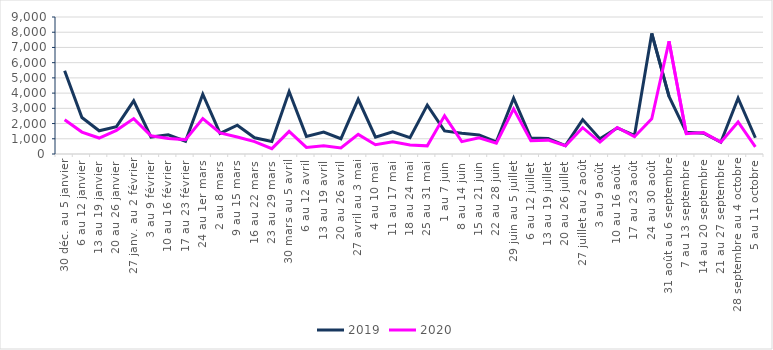
| Category | 2019 | 2020 |
|---|---|---|
| 30 déc. au 5 janvier | 5470 | 2254 |
| 6 au 12 janvier | 2400 | 1440 |
| 13 au 19 janvier | 1527 | 1049 |
| 20 au 26 janvier | 1798 | 1553 |
| 27 janv. au 2 février | 3495 | 2326 |
| 3 au 9 février | 1116 | 1200 |
| 10 au 16 février | 1260 | 1020 |
| 17 au 23 février | 841 | 946 |
| 24 au 1er mars | 3928 | 2332 |
| 2 au 8 mars | 1349 | 1382 |
| 9 au 15 mars | 1893 | 1114 |
| 16 au 22 mars | 1068 | 810 |
| 23 au 29 mars | 828 | 350 |
| 30 mars au 5 avril | 4105 | 1483 |
| 6 au 12 avril | 1156 | 435 |
| 13 au 19 avril | 1440 | 539 |
| 20 au 26 avril | 1002 | 398 |
| 27 avril au 3 mai | 3595 | 1291 |
| 4 au 10 mai | 1106 | 609 |
| 11 au 17 mai | 1456 | 809 |
| 18 au 24 mai | 1078 | 595 |
| 25 au 31 mai | 3215 | 535 |
| 1 au 7 juin | 1515 | 2506 |
| 8 au 14 juin | 1366 | 815 |
| 15 au 21 juin | 1252 | 1061 |
| 22 au 28 juin | 799 | 713 |
| 29 juin au 5 juillet | 3667 | 2963 |
| 6 au 12 juillet | 1051 | 875 |
| 13 au 19 juillet | 1024 | 911 |
| 20 au 26 juillet | 555 | 542 |
| 27 juillet au 2 août | 2260 | 1729 |
| 3 au 9 août | 993 | 781 |
| 10 au 16 août  | 1713 | 1744 |
| 17 au 23 août | 1221 | 1138 |
| 24 au 30 août | 7919 | 2311 |
| 31 août au 6 septembre | 3784 | 7407 |
| 7 au 13 septembre | 1424 | 1332 |
| 14 au 20 septembre | 1366 | 1408 |
| 21 au 27 septembre | 775 | 781 |
| 28 septembre au 4 octobre | 3671 | 2107 |
| 5 au 11 octobre | 1066 | 472 |